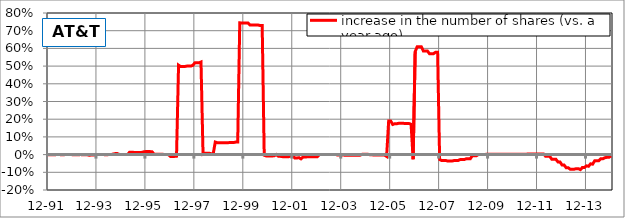
| Category | increase in the number of shares (vs. a year ago) |
|---|---|
| 1991-12-31 | 0 |
| 1992-01-31 | 0 |
| 1992-02-28 | 0 |
| 1992-03-31 | 0 |
| 1992-04-30 | 0 |
| 1992-05-29 | 0.001 |
| 1992-06-30 | 0 |
| 1992-07-31 | 0 |
| 1992-08-31 | 0 |
| 1992-09-30 | 0.001 |
| 1992-10-30 | 0.001 |
| 1992-11-30 | 0.001 |
| 1992-12-31 | -0.001 |
| 1993-01-29 | -0.001 |
| 1993-02-26 | -0.001 |
| 1993-03-31 | -0.001 |
| 1993-04-30 | 0 |
| 1993-05-31 | -0.001 |
| 1993-06-30 | 0 |
| 1993-07-30 | 0 |
| 1993-08-31 | -0.003 |
| 1993-09-30 | -0.003 |
| 1993-10-29 | -0.003 |
| 1993-11-30 | -0.001 |
| 1993-12-31 | 0 |
| 1994-01-31 | 0 |
| 1994-02-28 | 0 |
| 1994-03-31 | 0 |
| 1994-04-29 | -0.001 |
| 1994-05-31 | -0.001 |
| 1994-06-30 | 0 |
| 1994-07-29 | 0 |
| 1994-08-31 | 0.003 |
| 1994-09-30 | 0.006 |
| 1994-10-31 | 0.006 |
| 1994-11-30 | 0 |
| 1994-12-30 | 0 |
| 1995-01-31 | 0 |
| 1995-02-28 | 0 |
| 1995-03-31 | 0 |
| 1995-04-28 | 0.014 |
| 1995-05-31 | 0.014 |
| 1995-06-30 | 0.013 |
| 1995-07-31 | 0.013 |
| 1995-08-31 | 0.012 |
| 1995-09-29 | 0.013 |
| 1995-10-31 | 0.013 |
| 1995-11-30 | 0.016 |
| 1995-12-29 | 0.017 |
| 1996-01-31 | 0.017 |
| 1996-02-29 | 0.017 |
| 1996-03-29 | 0.016 |
| 1996-04-30 | 0.003 |
| 1996-05-31 | 0.002 |
| 1996-06-28 | 0.002 |
| 1996-07-31 | 0.002 |
| 1996-08-30 | 0.003 |
| 1996-09-30 | 0 |
| 1996-10-31 | 0 |
| 1996-11-29 | 0 |
| 1996-12-31 | -0.01 |
| 1997-01-31 | -0.01 |
| 1997-02-28 | -0.01 |
| 1997-03-31 | -0.009 |
| 1997-04-30 | 0.505 |
| 1997-05-30 | 0.498 |
| 1997-06-30 | 0.498 |
| 1997-07-31 | 0.498 |
| 1997-08-29 | 0.5 |
| 1997-09-30 | 0.5 |
| 1997-10-31 | 0.5 |
| 1997-11-28 | 0.504 |
| 1997-12-31 | 0.518 |
| 1998-01-30 | 0.518 |
| 1998-02-27 | 0.518 |
| 1998-03-31 | 0.523 |
| 1998-04-30 | 0.003 |
| 1998-05-29 | 0.008 |
| 1998-06-30 | 0.008 |
| 1998-07-31 | 0.008 |
| 1998-08-31 | 0.005 |
| 1998-09-30 | 0.005 |
| 1998-10-30 | 0.071 |
| 1998-11-30 | 0.067 |
| 1998-12-31 | 0.067 |
| 1999-01-29 | 0.067 |
| 1999-02-26 | 0.067 |
| 1999-03-31 | 0.067 |
| 1999-04-30 | 0.067 |
| 1999-05-31 | 0.068 |
| 1999-06-30 | 0.068 |
| 1999-07-30 | 0.068 |
| 1999-08-31 | 0.071 |
| 1999-09-30 | 0.071 |
| 1999-10-29 | 0.744 |
| 1999-11-30 | 0.744 |
| 1999-12-31 | 0.744 |
| 2000-01-31 | 0.744 |
| 2000-02-29 | 0.744 |
| 2000-03-31 | 0.732 |
| 2000-04-28 | 0.732 |
| 2000-05-31 | 0.732 |
| 2000-06-30 | 0.732 |
| 2000-07-31 | 0.732 |
| 2000-08-31 | 0.729 |
| 2000-09-29 | 0.729 |
| 2000-10-31 | -0.004 |
| 2000-11-30 | -0.008 |
| 2000-12-29 | -0.008 |
| 2001-01-31 | -0.008 |
| 2001-02-28 | -0.008 |
| 2001-03-30 | -0.006 |
| 2001-04-30 | 0.001 |
| 2001-05-31 | -0.01 |
| 2001-06-29 | -0.01 |
| 2001-07-31 | -0.012 |
| 2001-08-31 | -0.012 |
| 2001-09-28 | -0.012 |
| 2001-10-31 | -0.012 |
| 2001-11-30 | -0.007 |
| 2001-12-31 | -0.007 |
| 2002-01-31 | -0.019 |
| 2002-02-28 | -0.019 |
| 2002-03-29 | -0.017 |
| 2002-04-30 | -0.024 |
| 2002-05-31 | -0.014 |
| 2002-06-28 | -0.014 |
| 2002-07-31 | -0.012 |
| 2002-08-30 | -0.012 |
| 2002-09-30 | -0.012 |
| 2002-10-31 | -0.012 |
| 2002-11-29 | -0.012 |
| 2002-12-31 | -0.012 |
| 2003-01-31 | 0 |
| 2003-02-28 | 0 |
| 2003-03-31 | 0 |
| 2003-04-30 | 0.001 |
| 2003-05-30 | 0.001 |
| 2003-06-30 | 0.001 |
| 2003-07-31 | 0.001 |
| 2003-08-29 | 0.001 |
| 2003-09-30 | 0.001 |
| 2003-10-31 | -0.003 |
| 2003-11-28 | -0.003 |
| 2003-12-31 | -0.003 |
| 2004-01-30 | -0.003 |
| 2004-02-27 | -0.004 |
| 2004-03-31 | -0.004 |
| 2004-04-30 | -0.003 |
| 2004-05-31 | -0.003 |
| 2004-06-30 | -0.003 |
| 2004-07-30 | -0.003 |
| 2004-08-31 | -0.003 |
| 2004-09-30 | -0.003 |
| 2004-10-29 | 0.001 |
| 2004-11-30 | 0.001 |
| 2004-12-31 | 0.001 |
| 2005-01-31 | 0.001 |
| 2005-02-28 | -0.001 |
| 2005-03-31 | -0.001 |
| 2005-04-29 | -0.003 |
| 2005-05-31 | -0.003 |
| 2005-06-30 | -0.003 |
| 2005-07-29 | -0.003 |
| 2005-08-31 | -0.003 |
| 2005-09-30 | -0.003 |
| 2005-10-31 | -0.01 |
| 2005-11-30 | 0.19 |
| 2005-12-30 | 0.19 |
| 2006-01-31 | 0.17 |
| 2006-02-28 | 0.174 |
| 2006-03-31 | 0.174 |
| 2006-04-28 | 0.177 |
| 2006-05-31 | 0.177 |
| 2006-06-30 | 0.177 |
| 2006-07-31 | 0.176 |
| 2006-08-31 | 0.176 |
| 2006-09-29 | 0.176 |
| 2006-10-31 | 0.171 |
| 2006-11-30 | -0.026 |
| 2006-12-29 | 0.582 |
| 2007-01-31 | 0.609 |
| 2007-02-28 | 0.609 |
| 2007-03-30 | 0.609 |
| 2007-04-30 | 0.586 |
| 2007-05-31 | 0.586 |
| 2007-06-29 | 0.586 |
| 2007-07-31 | 0.57 |
| 2007-08-31 | 0.57 |
| 2007-09-28 | 0.57 |
| 2007-10-31 | 0.578 |
| 2007-11-30 | 0.578 |
| 2007-12-31 | -0.028 |
| 2008-01-31 | -0.033 |
| 2008-02-29 | -0.033 |
| 2008-03-31 | -0.033 |
| 2008-04-30 | -0.036 |
| 2008-05-30 | -0.036 |
| 2008-06-30 | -0.036 |
| 2008-07-31 | -0.034 |
| 2008-08-29 | -0.034 |
| 2008-09-30 | -0.034 |
| 2008-10-31 | -0.028 |
| 2008-11-28 | -0.028 |
| 2008-12-31 | -0.028 |
| 2009-01-30 | -0.024 |
| 2009-02-27 | -0.024 |
| 2009-03-31 | -0.024 |
| 2009-04-30 | -0.007 |
| 2009-05-29 | -0.007 |
| 2009-06-30 | -0.007 |
| 2009-07-31 | 0.001 |
| 2009-08-31 | 0.001 |
| 2009-09-30 | 0.001 |
| 2009-10-30 | 0.001 |
| 2009-11-30 | 0.001 |
| 2009-12-31 | 0.001 |
| 2010-01-29 | 0.001 |
| 2010-02-26 | 0.001 |
| 2010-03-31 | 0.001 |
| 2010-04-30 | 0.002 |
| 2010-05-31 | 0.002 |
| 2010-06-30 | 0.002 |
| 2010-07-30 | 0.002 |
| 2010-08-31 | 0.002 |
| 2010-09-30 | 0.002 |
| 2010-10-29 | 0.002 |
| 2010-11-30 | 0.002 |
| 2010-12-31 | 0.002 |
| 2011-01-31 | 0.002 |
| 2011-02-28 | 0.002 |
| 2011-03-31 | 0.002 |
| 2011-04-29 | 0.002 |
| 2011-05-31 | 0.002 |
| 2011-06-30 | 0.002 |
| 2011-07-29 | 0.003 |
| 2011-08-31 | 0.003 |
| 2011-09-30 | 0.003 |
| 2011-10-31 | 0.003 |
| 2011-11-30 | 0.003 |
| 2011-12-30 | 0.003 |
| 2012-01-31 | 0.003 |
| 2012-02-29 | 0.003 |
| 2012-03-30 | 0.003 |
| 2012-04-30 | -0.01 |
| 2012-05-31 | -0.01 |
| 2012-06-29 | -0.01 |
| 2012-07-31 | -0.026 |
| 2012-08-31 | -0.026 |
| 2012-09-28 | -0.026 |
| 2012-10-31 | -0.042 |
| 2012-11-30 | -0.042 |
| 2012-12-31 | -0.058 |
| 2013-01-31 | -0.059 |
| 2013-02-28 | -0.074 |
| 2013-03-29 | -0.074 |
| 2013-04-30 | -0.082 |
| 2013-05-31 | -0.082 |
| 2013-06-28 | -0.082 |
| 2013-07-31 | -0.079 |
| 2013-08-30 | -0.079 |
| 2013-09-30 | -0.085 |
| 2013-10-31 | -0.073 |
| 2013-11-30 | -0.073 |
| 2013-12-31 | -0.064 |
| 2014-01-31 | -0.066 |
| 2014-02-28 | -0.052 |
| 2014-03-31 | -0.054 |
| 2014-04-30 | -0.035 |
| 2014-05-31 | -0.035 |
| 2014-06-30 | -0.035 |
| 2014-07-31 | -0.024 |
| 2014-08-31 | -0.024 |
| 2014-09-30 | -0.018 |
| 2014-10-31 | -0.015 |
| 2014-11-30 | -0.015 |
| 2014-12-31 | -0.007 |